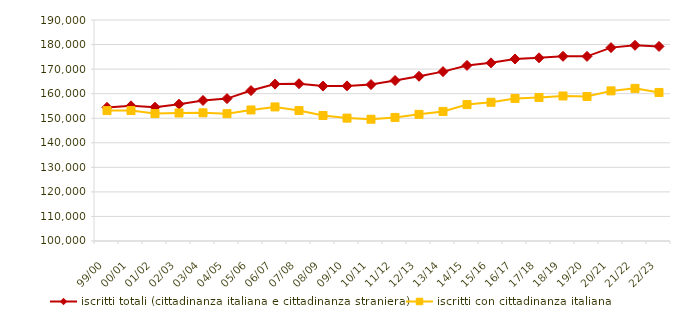
| Category | iscritti totali (cittadinanza italiana e cittadinanza straniera) | iscritti con cittadinanza italiana |
|---|---|---|
| 99/00 | 154413 | 153105 |
| 00/01 | 155040 | 153136 |
| 01/02 | 154484 | 151897 |
| 02/03 | 155707 | 152137 |
| 03/04 | 157225 | 152205 |
| 04/05 | 157996 | 151859 |
| 05/06 | 161264 | 153364 |
| 06/07 | 163890 | 154604 |
| 07/08 | 164047 | 153136 |
| 08/09 | 163092 | 151112 |
| 09/10 | 163172 | 150043 |
| 10/11 | 163712 | 149588 |
| 11/12 | 165361 | 150324 |
| 12/13 | 167084 | 151583 |
| 13/14 | 168982 | 152769 |
| 14/15 | 171491 | 155555 |
| 15/16 | 172551 | 156501 |
| 16/17 | 174119 | 158068 |
| 17/18 | 174599 | 158451 |
| 18/19 | 175223 | 159062 |
| 19/20 | 175187 | 158842 |
| 20/21 | 178753 | 161133 |
| 21/22 | 179707 | 162167 |
| 22/23 | 179224 | 160488 |